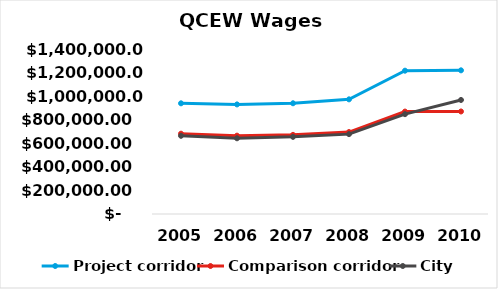
| Category | Project corridor | Comparison corridor | City |
|---|---|---|---|
| 2005.0 | 939192 | 681376 | 663497.167 |
| 2006.0 | 929800.08 | 664682.288 | 642414.938 |
| 2007.0 | 939562.981 | 671462.047 | 654544.462 |
| 2008.0 | 972823.51 | 695231.804 | 677715.336 |
| 2009.0 | 1216029.388 | 869039.755 | 847144.17 |
| 2010.0 | 1219069.461 | 869908.795 | 967640.837 |